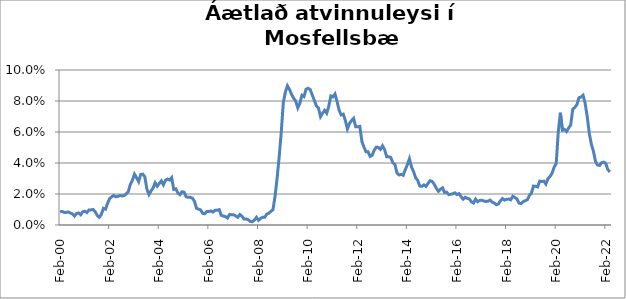
| Category | Series 0 |
|---|---|
| 2000-02-01 | 0.008 |
| 2000-03-01 | 0.009 |
| 2000-04-01 | 0.008 |
| 2000-05-01 | 0.008 |
| 2000-06-01 | 0.008 |
| 2000-07-01 | 0.008 |
| 2000-08-01 | 0.007 |
| 2000-09-01 | 0.006 |
| 2000-10-01 | 0.007 |
| 2000-11-01 | 0.008 |
| 2000-12-01 | 0.007 |
| 2001-01-01 | 0.009 |
| 2001-02-01 | 0.009 |
| 2001-03-01 | 0.008 |
| 2001-04-01 | 0.01 |
| 2001-05-01 | 0.01 |
| 2001-06-01 | 0.01 |
| 2001-07-01 | 0.009 |
| 2001-08-01 | 0.006 |
| 2001-09-01 | 0.005 |
| 2001-10-01 | 0.007 |
| 2001-11-01 | 0.011 |
| 2001-12-01 | 0.01 |
| 2002-01-01 | 0.014 |
| 2002-02-01 | 0.017 |
| 2002-03-01 | 0.018 |
| 2002-04-01 | 0.019 |
| 2002-05-01 | 0.018 |
| 2002-06-01 | 0.018 |
| 2002-07-01 | 0.019 |
| 2002-08-01 | 0.019 |
| 2002-09-01 | 0.019 |
| 2002-10-01 | 0.02 |
| 2002-11-01 | 0.021 |
| 2002-12-01 | 0.026 |
| 2003-01-01 | 0.029 |
| 2003-02-01 | 0.033 |
| 2003-03-01 | 0.031 |
| 2003-04-01 | 0.028 |
| 2003-05-01 | 0.033 |
| 2003-06-01 | 0.033 |
| 2003-07-01 | 0.031 |
| 2003-08-01 | 0.023 |
| 2003-09-01 | 0.02 |
| 2003-10-01 | 0.022 |
| 2003-11-01 | 0.024 |
| 2003-12-01 | 0.027 |
| 2004-01-01 | 0.025 |
| 2004-02-01 | 0.027 |
| 2004-03-01 | 0.028 |
| 2004-04-01 | 0.026 |
| 2004-05-01 | 0.029 |
| 2004-06-01 | 0.03 |
| 2004-07-01 | 0.029 |
| 2004-08-01 | 0.031 |
| 2004-09-01 | 0.023 |
| 2004-10-01 | 0.023 |
| 2004-11-01 | 0.021 |
| 2004-12-01 | 0.02 |
| 2005-01-01 | 0.021 |
| 2005-02-01 | 0.021 |
| 2005-03-01 | 0.018 |
| 2005-04-01 | 0.018 |
| 2005-05-01 | 0.018 |
| 2005-06-01 | 0.017 |
| 2005-07-01 | 0.015 |
| 2005-08-01 | 0.011 |
| 2005-09-01 | 0.01 |
| 2005-10-01 | 0.01 |
| 2005-11-01 | 0.007 |
| 2005-12-01 | 0.007 |
| 2006-01-01 | 0.009 |
| 2006-02-01 | 0.009 |
| 2006-03-01 | 0.009 |
| 2006-04-01 | 0.008 |
| 2006-05-01 | 0.01 |
| 2006-06-01 | 0.01 |
| 2006-07-01 | 0.01 |
| 2006-08-01 | 0.006 |
| 2006-09-01 | 0.006 |
| 2006-10-01 | 0.005 |
| 2006-11-01 | 0.004 |
| 2006-12-01 | 0.007 |
| 2007-01-01 | 0.007 |
| 2007-02-01 | 0.007 |
| 2007-03-01 | 0.006 |
| 2007-04-01 | 0.005 |
| 2007-05-01 | 0.007 |
| 2007-06-01 | 0.006 |
| 2007-07-01 | 0.004 |
| 2007-08-01 | 0.004 |
| 2007-09-01 | 0.003 |
| 2007-10-01 | 0.002 |
| 2007-11-01 | 0.002 |
| 2007-12-01 | 0.003 |
| 2008-01-01 | 0.005 |
| 2008-02-01 | 0.003 |
| 2008-03-01 | 0.004 |
| 2008-04-01 | 0.005 |
| 2008-05-01 | 0.005 |
| 2008-06-01 | 0.007 |
| 2008-07-01 | 0.008 |
| 2008-08-01 | 0.009 |
| 2008-09-01 | 0.01 |
| 2008-10-01 | 0.019 |
| 2008-11-01 | 0.03 |
| 2008-12-01 | 0.044 |
| 2009-01-01 | 0.06 |
| 2009-02-01 | 0.079 |
| 2009-03-01 | 0.086 |
| 2009-04-01 | 0.09 |
| 2009-05-01 | 0.088 |
| 2009-06-01 | 0.084 |
| 2009-07-01 | 0.082 |
| 2009-08-01 | 0.08 |
| 2009-09-01 | 0.076 |
| 2009-10-01 | 0.079 |
| 2009-11-01 | 0.084 |
| 2009-12-01 | 0.083 |
| 2010-01-01 | 0.088 |
| 2010-02-01 | 0.088 |
| 2010-03-01 | 0.087 |
| 2010-04-01 | 0.084 |
| 2010-05-01 | 0.08 |
| 2010-06-01 | 0.077 |
| 2010-07-01 | 0.075 |
| 2010-08-01 | 0.07 |
| 2010-09-01 | 0.072 |
| 2010-10-01 | 0.074 |
| 2010-11-01 | 0.072 |
| 2010-12-01 | 0.077 |
| 2011-01-01 | 0.083 |
| 2011-02-01 | 0.083 |
| 2011-03-01 | 0.085 |
| 2011-04-01 | 0.08 |
| 2011-05-01 | 0.074 |
| 2011-06-01 | 0.071 |
| 2011-07-01 | 0.072 |
| 2011-08-01 | 0.067 |
| 2011-09-01 | 0.062 |
| 2011-10-01 | 0.065 |
| 2011-11-01 | 0.067 |
| 2011-12-01 | 0.069 |
| 2012-01-01 | 0.063 |
| 2012-02-01 | 0.063 |
| 2012-03-01 | 0.064 |
| 2012-04-01 | 0.054 |
| 2012-05-01 | 0.05 |
| 2012-06-01 | 0.047 |
| 2012-07-01 | 0.047 |
| 2012-08-01 | 0.044 |
| 2012-09-01 | 0.045 |
| 2012-10-01 | 0.048 |
| 2012-11-01 | 0.05 |
| 2012-12-01 | 0.05 |
| 2013-01-01 | 0.049 |
| 2013-02-01 | 0.051 |
| 2013-03-01 | 0.049 |
| 2013-04-01 | 0.044 |
| 2013-05-01 | 0.044 |
| 2013-06-01 | 0.043 |
| 2013-07-01 | 0.04 |
| 2013-08-01 | 0.039 |
| 2013-09-01 | 0.033 |
| 2013-10-01 | 0.032 |
| 2013-11-01 | 0.033 |
| 2013-12-01 | 0.032 |
| 2014-01-01 | 0.036 |
| 2014-02-01 | 0.039 |
| 2014-03-01 | 0.043 |
| 2014-04-01 | 0.037 |
| 2014-05-01 | 0.034 |
| 2014-06-01 | 0.03 |
| 2014-07-01 | 0.029 |
| 2014-08-01 | 0.025 |
| 2014-09-01 | 0.025 |
| 2014-10-01 | 0.026 |
| 2014-11-01 | 0.025 |
| 2014-12-01 | 0.027 |
| 2015-01-01 | 0.029 |
| 2015-02-01 | 0.028 |
| 2015-03-01 | 0.026 |
| 2015-04-01 | 0.024 |
| 2015-05-01 | 0.022 |
| 2015-06-01 | 0.023 |
| 2015-07-01 | 0.024 |
| 2015-08-01 | 0.021 |
| 2015-09-01 | 0.021 |
| 2015-10-01 | 0.02 |
| 2015-11-01 | 0.02 |
| 2015-12-01 | 0.02 |
| 2016-01-01 | 0.021 |
| 2016-02-01 | 0.02 |
| 2016-03-01 | 0.02 |
| 2016-04-01 | 0.018 |
| 2016-05-01 | 0.017 |
| 2016-06-01 | 0.018 |
| 2016-07-01 | 0.017 |
| 2016-08-01 | 0.017 |
| 2016-09-01 | 0.015 |
| 2016-10-01 | 0.014 |
| 2016-11-01 | 0.017 |
| 2016-12-01 | 0.015 |
| 2017-01-01 | 0.016 |
| 2017-02-01 | 0.016 |
| 2017-03-01 | 0.015 |
| 2017-04-01 | 0.015 |
| 2017-05-01 | 0.015 |
| 2017-06-01 | 0.016 |
| 2017-07-01 | 0.015 |
| 2017-08-01 | 0.014 |
| 2017-09-01 | 0.013 |
| 2017-10-01 | 0.014 |
| 2017-11-01 | 0.016 |
| 2017-12-01 | 0.017 |
| 2018-01-01 | 0.016 |
| 2018-02-01 | 0.017 |
| 2018-03-01 | 0.017 |
| 2018-04-01 | 0.016 |
| 2018-05-01 | 0.019 |
| 2018-06-01 | 0.018 |
| 2018-07-01 | 0.017 |
| 2018-08-01 | 0.014 |
| 2018-09-01 | 0.014 |
| 2018-10-01 | 0.015 |
| 2018-11-01 | 0.016 |
| 2018-12-01 | 0.016 |
| 2019-01-01 | 0.019 |
| 2019-02-01 | 0.021 |
| 2019-03-01 | 0.025 |
| 2019-04-01 | 0.025 |
| 2019-05-01 | 0.025 |
| 2019-06-01 | 0.028 |
| 2019-07-01 | 0.028 |
| 2019-08-01 | 0.028 |
| 2019-09-01 | 0.026 |
| 2019-10-01 | 0.03 |
| 2019-11-01 | 0.031 |
| 2019-12-01 | 0.033 |
| 2020-01-01 | 0.037 |
| 2020-02-01 | 0.04 |
| 2020-03-01 | 0.06 |
| 2020-04-01 | 0.072 |
| 2020-05-01 | 0.061 |
| 2020-06-01 | 0.062 |
| 2020-07-01 | 0.06 |
| 2020-08-01 | 0.063 |
| 2020-09-01 | 0.065 |
| 2020-10-01 | 0.075 |
| 2020-11-01 | 0.076 |
| 2020-12-01 | 0.078 |
| 2021-01-01 | 0.082 |
| 2021-02-01 | 0.083 |
| 2021-03-01 | 0.084 |
| 2021-04-01 | 0.078 |
| 2021-05-01 | 0.07 |
| 2021-06-01 | 0.059 |
| 2021-07-01 | 0.052 |
| 2021-08-01 | 0.048 |
| 2021-09-01 | 0.041 |
| 2021-10-01 | 0.039 |
| 2021-11-01 | 0.038 |
| 2021-12-01 | 0.04 |
| 2022-01-01 | 0.041 |
| 2022-02-01 | 0.04 |
| 2022-03-01 | 0.036 |
| 2022-04-01 | 0.034 |